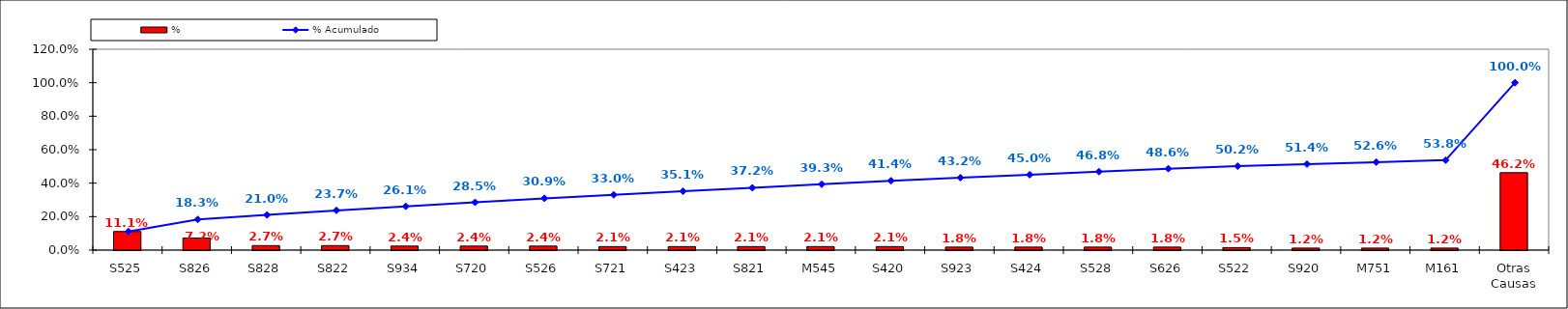
| Category | % |
|---|---|
| S525 | 0.111 |
| S826 | 0.072 |
| S828 | 0.027 |
| S822 | 0.027 |
| S934 | 0.024 |
| S720 | 0.024 |
| S526 | 0.024 |
| S721 | 0.021 |
| S423 | 0.021 |
| S821 | 0.021 |
| M545 | 0.021 |
| S420 | 0.021 |
| S923 | 0.018 |
| S424 | 0.018 |
| S528 | 0.018 |
| S626 | 0.018 |
| S522 | 0.015 |
| S920 | 0.012 |
| M751 | 0.012 |
| M161 | 0.012 |
| Otras Causas | 0.462 |